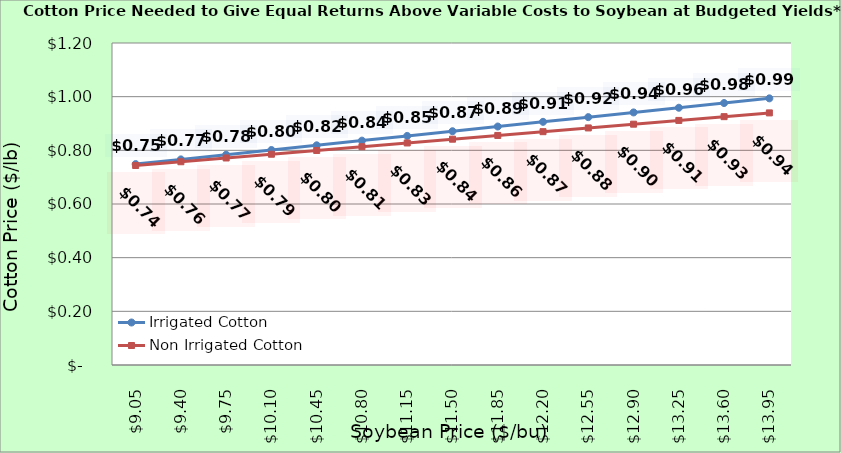
| Category | Irrigated Cotton | Non Irrigated Cotton |
|---|---|---|
| 9.050000000000002 | 0.749 | 0.743 |
| 9.400000000000002 | 0.766 | 0.757 |
| 9.750000000000002 | 0.784 | 0.771 |
| 10.100000000000001 | 0.801 | 0.785 |
| 10.450000000000001 | 0.819 | 0.799 |
| 10.8 | 0.836 | 0.813 |
| 11.15 | 0.854 | 0.827 |
| 11.5 | 0.871 | 0.841 |
| 11.85 | 0.889 | 0.855 |
| 12.2 | 0.906 | 0.869 |
| 12.549999999999999 | 0.924 | 0.883 |
| 12.899999999999999 | 0.941 | 0.897 |
| 13.249999999999998 | 0.959 | 0.911 |
| 13.599999999999998 | 0.976 | 0.925 |
| 13.949999999999998 | 0.994 | 0.939 |